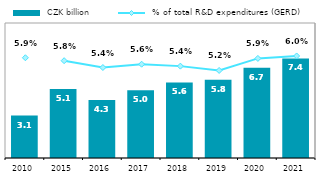
| Category |  CZK billion |
|---|---|
| 2010.0 | 3.147 |
| 2015.0 | 5.112 |
| 2016.0 | 4.295 |
| 2017.0 | 5.024 |
| 2018.0 | 5.594 |
| 2019.0 | 5.791 |
| 2020.0 | 6.691 |
| 2021.0 | 7.372 |